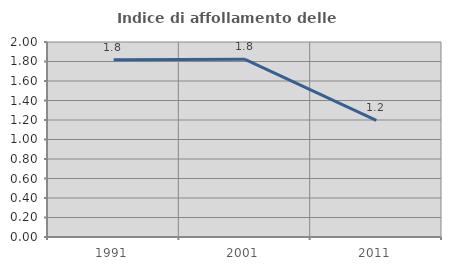
| Category | Indice di affollamento delle abitazioni  |
|---|---|
| 1991.0 | 1.818 |
| 2001.0 | 1.822 |
| 2011.0 | 1.196 |